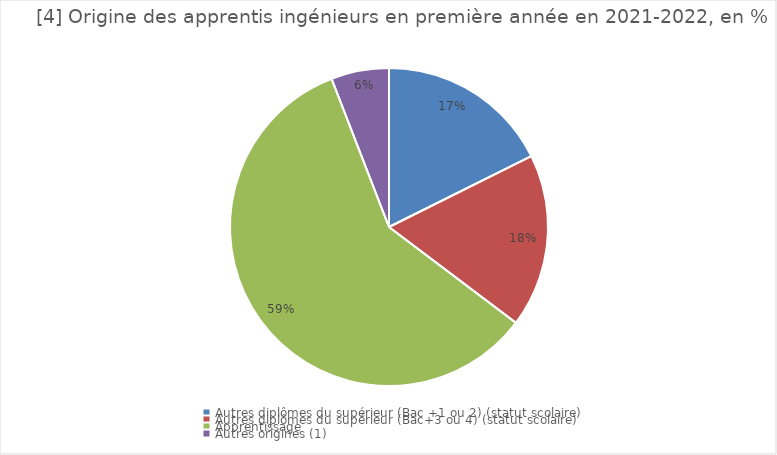
| Category | Series 0 |
|---|---|
| Autres diplômes du supérieur (Bac +1 ou 2) (statut scolaire) | 17.647 |
| Autres diplômes du supérieur (Bac+3 ou 4) (statut scolaire) | 17.647 |
| Apprentissage  | 58.824 |
| Autres origines (1) | 5.882 |